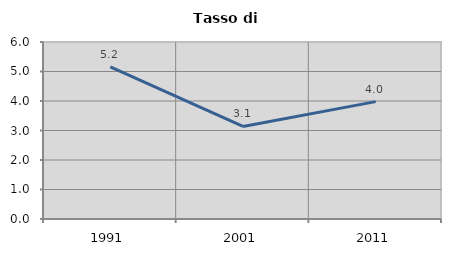
| Category | Tasso di disoccupazione   |
|---|---|
| 1991.0 | 5.159 |
| 2001.0 | 3.137 |
| 2011.0 | 3.978 |